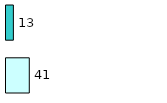
| Category | Series 0 | Series 1 |
|---|---|---|
| 0 | 41 | 13 |